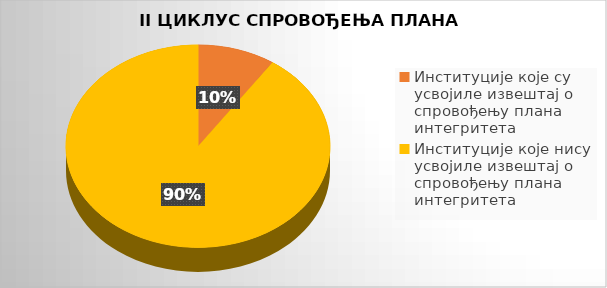
| Category | Series 0 |
|---|---|
| Институције које су усвојиле извештај о спровођењу плана интегритета | 0.095 |
| Институције које нису усвојиле извештај о спровођењу плана интегритета | 0.905 |